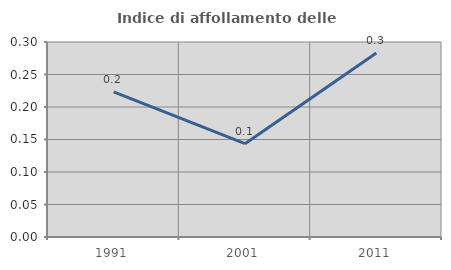
| Category | Indice di affollamento delle abitazioni  |
|---|---|
| 1991.0 | 0.223 |
| 2001.0 | 0.144 |
| 2011.0 | 0.283 |